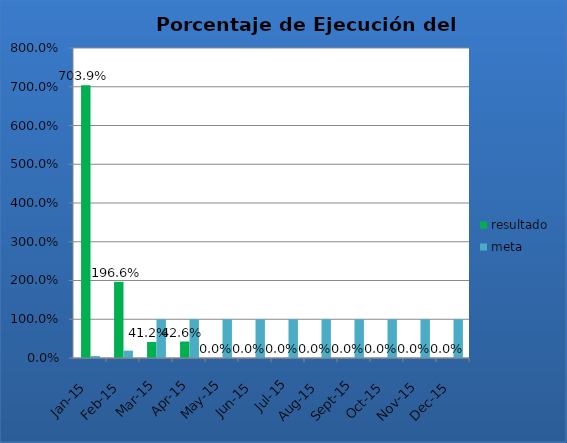
| Category | resultado | meta |
|---|---|---|
| ene-15 | 7.039 | 0.05 |
| feb-15 | 1.966 | 0.19 |
| mar-15 | 0.412 | 1 |
| abr-15 | 0.426 | 1 |
| may-15 | 0 | 1 |
| jun-15 | 0 | 1 |
| jul-15 | 0 | 1 |
| ago-15 | 0 | 1 |
| sep-15 | 0 | 1 |
| oct-15 | 0 | 1 |
| nov-15 | 0 | 1 |
| dic-15 | 0 | 1 |